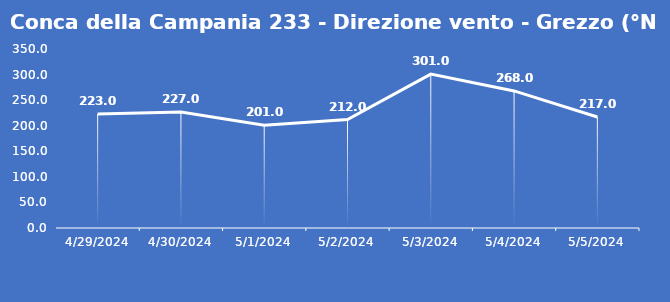
| Category | Conca della Campania 233 - Direzione vento - Grezzo (°N) |
|---|---|
| 4/29/24 | 223 |
| 4/30/24 | 227 |
| 5/1/24 | 201 |
| 5/2/24 | 212 |
| 5/3/24 | 301 |
| 5/4/24 | 268 |
| 5/5/24 | 217 |